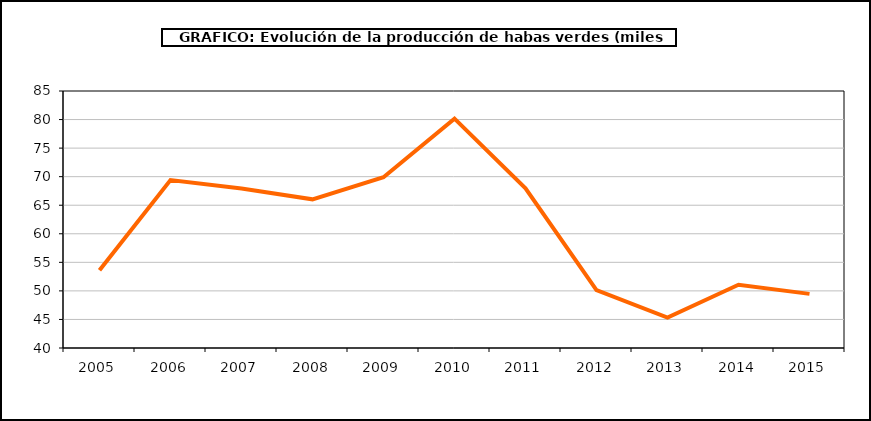
| Category | producción |
|---|---|
| 2005.0 | 53.619 |
| 2006.0 | 69.402 |
| 2007.0 | 67.944 |
| 2008.0 | 66.032 |
| 2009.0 | 69.903 |
| 2010.0 | 80.156 |
| 2011.0 | 67.971 |
| 2012.0 | 50.149 |
| 2013.0 | 45.318 |
| 2014.0 | 51.081 |
| 2015.0 | 49.478 |